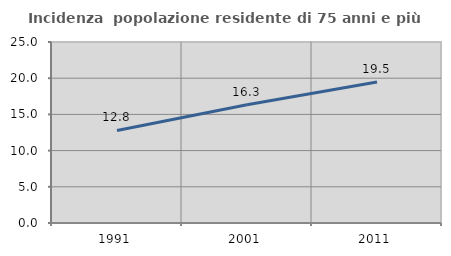
| Category | Incidenza  popolazione residente di 75 anni e più |
|---|---|
| 1991.0 | 12.785 |
| 2001.0 | 16.346 |
| 2011.0 | 19.474 |